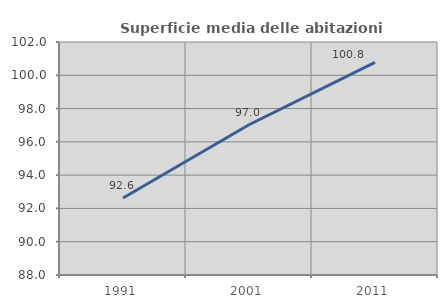
| Category | Superficie media delle abitazioni occupate |
|---|---|
| 1991.0 | 92.622 |
| 2001.0 | 97.029 |
| 2011.0 | 100.776 |